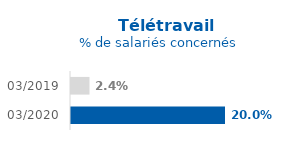
| Category | Series 1 |
|---|---|
| 03/2020 | 0.2 |
| 03/2019 | 0.024 |